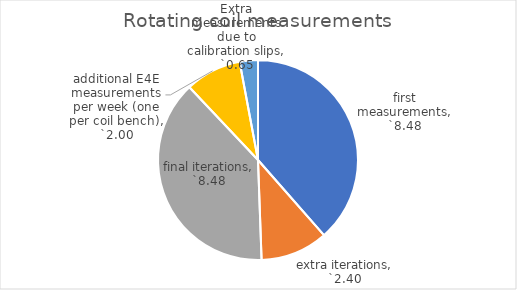
| Category | Rotating coil measurements |
|---|---|
| first measurements | 8.48 |
| extra iterations | 2.396 |
| final iterations | 8.48 |
| additional E4E measurements per week (one per coil bench) | 2 |
| Extra measurements due to calibration slips | 0.648 |